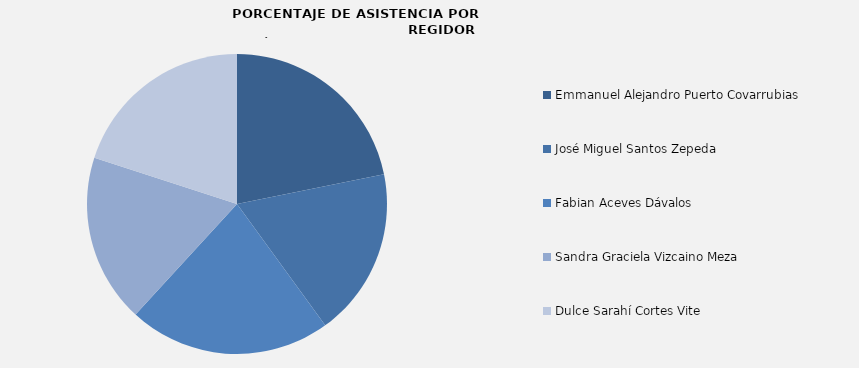
| Category | Series 0 |
|---|---|
| Emmanuel Alejandro Puerto Covarrubias | 120 |
| José Miguel Santos Zepeda | 100 |
| Fabian Aceves Dávalos | 120 |
| Sandra Graciela Vizcaino Meza | 100 |
| Dulce Sarahí Cortes Vite | 110 |